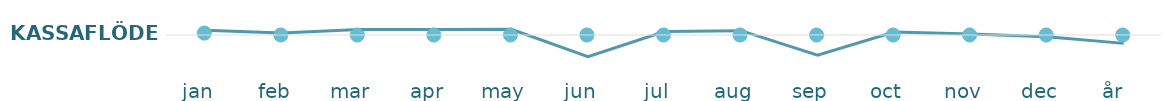
| Category | Kassaflöde |
|---|---|
| jan  | 169 |
| feb  | 69 |
| mar  | 192 |
| apr  | 199 |
| may  | 204 |
| jun  | -771 |
| jul  | 124 |
| aug  | 154 |
| sep  | -721 |
| oct  | 109 |
| nov  | 34 |
| dec  | -61 |
| år   | -299 |